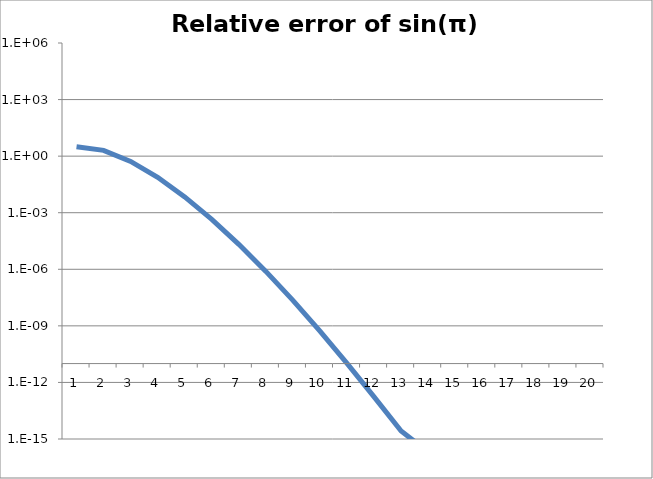
| Category | sin(π) approximation |
|---|---|
| 1.0 | 3.142 |
| 2.0 | 2.026 |
| 3.0 | 0.524 |
| 4.0 | 0.075 |
| 5.0 | 0.007 |
| 6.0 | 0 |
| 7.0 | 0 |
| 8.0 | 0 |
| 9.0 | 0 |
| 10.0 | 0 |
| 11.0 | 0 |
| 12.0 | 0 |
| 13.0 | 0 |
| 14.0 | 0 |
| 15.0 | 0 |
| 16.0 | 0 |
| 17.0 | 0 |
| 18.0 | 0 |
| 19.0 | 0 |
| 20.0 | 0 |